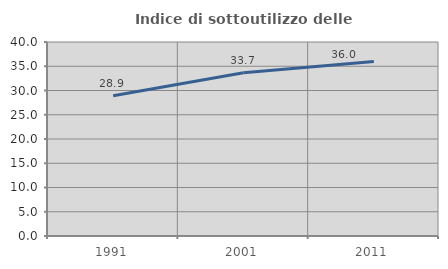
| Category | Indice di sottoutilizzo delle abitazioni  |
|---|---|
| 1991.0 | 28.897 |
| 2001.0 | 33.675 |
| 2011.0 | 35.983 |